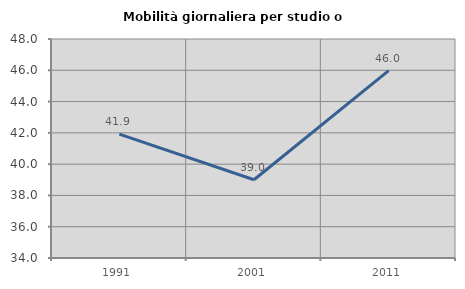
| Category | Mobilità giornaliera per studio o lavoro |
|---|---|
| 1991.0 | 41.916 |
| 2001.0 | 39.003 |
| 2011.0 | 45.981 |